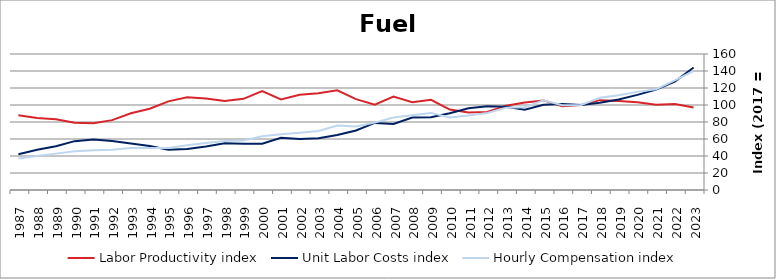
| Category | Labor Productivity index | Unit Labor Costs index | Hourly Compensation index |
|---|---|---|---|
| 2023.0 | 97.179 | 144.073 | 140.009 |
| 2022.0 | 101.056 | 127.638 | 128.986 |
| 2021.0 | 100.426 | 118.066 | 118.569 |
| 2020.0 | 103.176 | 111.882 | 115.435 |
| 2019.0 | 104.617 | 106.513 | 111.43 |
| 2018.0 | 105.724 | 102.701 | 108.58 |
| 2017.0 | 100 | 100 | 100 |
| 2016.0 | 98.599 | 101.129 | 99.713 |
| 2015.0 | 105.422 | 100.201 | 105.634 |
| 2014.0 | 103.054 | 94.475 | 97.361 |
| 2013.0 | 99.033 | 97.826 | 96.881 |
| 2012.0 | 91.911 | 98.505 | 90.536 |
| 2011.0 | 91.108 | 96.086 | 87.542 |
| 2010.0 | 94.61 | 90.219 | 85.356 |
| 2009.0 | 106.096 | 85.501 | 90.712 |
| 2008.0 | 103.284 | 85.213 | 88.011 |
| 2007.0 | 109.881 | 77.707 | 85.385 |
| 2006.0 | 100.443 | 78.894 | 79.244 |
| 2005.0 | 106.898 | 69.957 | 74.783 |
| 2004.0 | 117.276 | 64.613 | 75.776 |
| 2003.0 | 113.918 | 60.87 | 69.341 |
| 2002.0 | 112.166 | 59.95 | 67.244 |
| 2001.0 | 106.603 | 61.5 | 65.561 |
| 2000.0 | 116.409 | 54.421 | 63.351 |
| 1999.0 | 107.25 | 54.384 | 58.327 |
| 1998.0 | 104.721 | 54.936 | 57.529 |
| 1997.0 | 107.747 | 51.271 | 55.244 |
| 1996.0 | 109.224 | 48.234 | 52.683 |
| 1995.0 | 104.267 | 47.302 | 49.32 |
| 1994.0 | 95.624 | 51.68 | 49.419 |
| 1993.0 | 90.266 | 54.719 | 49.392 |
| 1992.0 | 82.202 | 57.583 | 47.335 |
| 1991.0 | 78.651 | 59.344 | 46.675 |
| 1990.0 | 79.193 | 57.461 | 45.505 |
| 1989.0 | 83.284 | 51.392 | 42.801 |
| 1988.0 | 84.758 | 47.348 | 40.131 |
| 1987.0 | 87.835 | 42.113 | 36.99 |